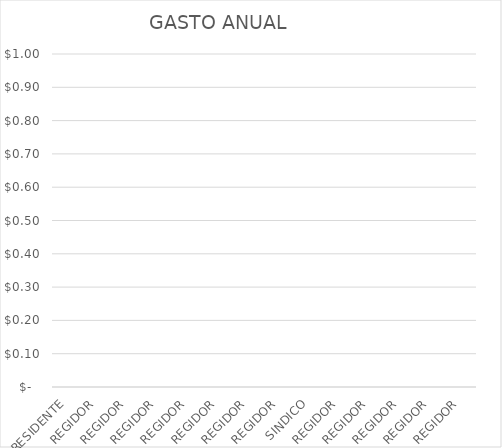
| Category | GASTO ANUAL |
|---|---|
| PRESIDENTE | 0 |
| REGIDOR | 0 |
| REGIDOR | 0 |
| REGIDOR | 0 |
| REGIDOR | 0 |
| REGIDOR | 0 |
| REGIDOR | 0 |
| REGIDOR | 0 |
| SINDICO | 0 |
| REGIDOR | 0 |
| REGIDOR | 0 |
| REGIDOR | 0 |
| REGIDOR | 0 |
| REGIDOR | 0 |